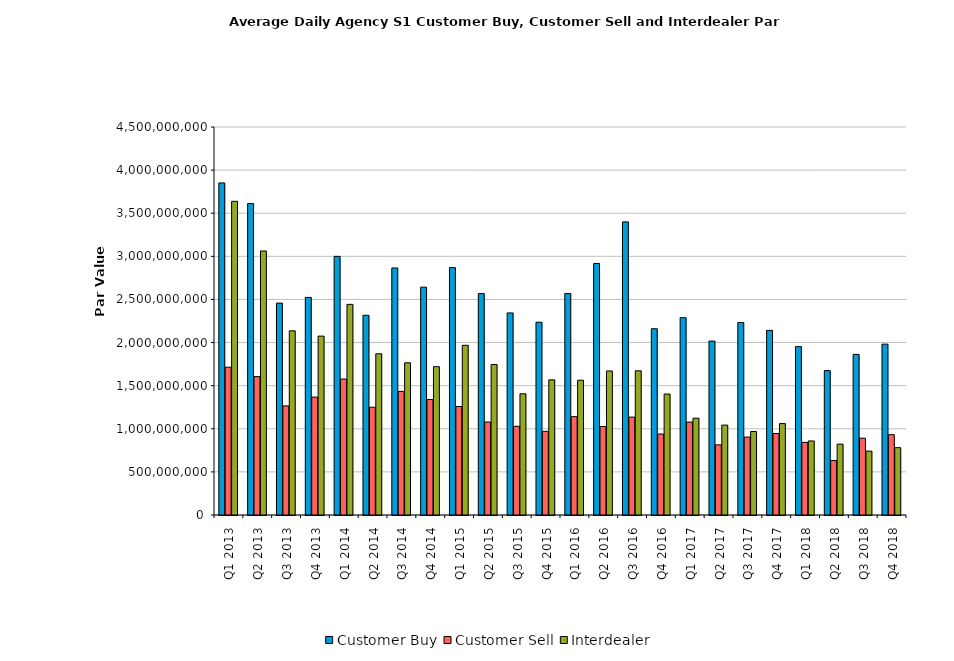
| Category | Customer Buy | Customer Sell | Interdealer |
|---|---|---|---|
| Q1 2013 | 3851219631.559 | 1713833452.241 | 3638013212.416 |
| Q2 2013 | 3612298106.7 | 1604934714.305 | 3062072229.235 |
| Q3 2013 | 2457537054.322 | 1264949555.257 | 2136022394.579 |
| Q4 2013 | 2523325341.425 | 1367516311.497 | 2074871198.099 |
| Q1 2014 | 2999642469.29 | 1576921705.138 | 2442904685.331 |
| Q2 2014 | 2316486911.388 | 1249686632.744 | 1869449035.493 |
| Q3 2014 | 2865047105.23 | 1433524489.264 | 1765300999.422 |
| Q4 2014 | 2642657071.748 | 1338943238.666 | 1720591089.445 |
| Q1 2015 | 2869493112.013 | 1258061076.446 | 1968039936.123 |
| Q2 2015 | 2567878881.385 | 1078331270.284 | 1745613692.501 |
| Q3 2015 | 2343524919.084 | 1028269042.485 | 1405607771.711 |
| Q4 2015 | 2235759044.268 | 970391456.275 | 1567503454.138 |
| Q1 2016 | 2568983491.342 | 1140791292.575 | 1563195402.666 |
| Q2 2016 | 2917274475.03 | 1026356965.009 | 1670545845.46 |
| Q3 2016 | 3399325753.161 | 1135281635.486 | 1672242018.388 |
| Q4 2016 | 2160327281.462 | 939002830.424 | 1403044499.216 |
| Q1 2017 | 2288549096.546 | 1078026778.301 | 1122683290.019 |
| Q2 2017 | 2016854071.308 | 813934660.294 | 1043002274.748 |
| Q3 2017 | 2232465339.305 | 903380763.894 | 968337710.99 |
| Q4 2017 | 2141415256.413 | 944944928.291 | 1060535846.087 |
| Q1 2018 | 1953070289.161 | 842225728.237 | 858924653.267 |
| Q2 2018 | 1675130757.897 | 631829280.343 | 822052220.44 |
| Q3 2018 | 1862749665.292 | 890746088.764 | 740998328.027 |
| Q4 2018 | 1981793898.347 | 931891609.234 | 780997176.341 |